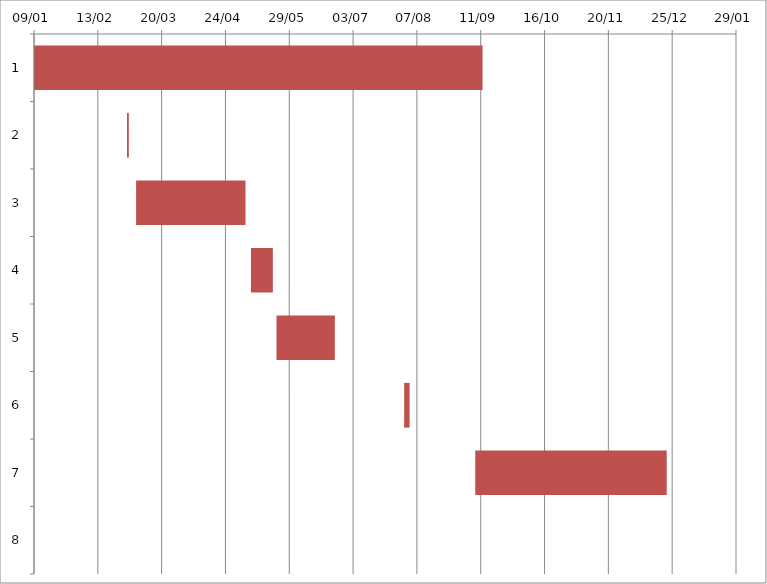
| Category | Fecha de inicio | DURACIÓN |
|---|---|---|
| 0 | 1/9/17 | 246 |
| 1 | 3/1/17 | 1 |
| 2 | 3/6/17 | 60 |
| 3 | 5/8/17 | 12 |
| 4 | 5/22/17 | 32 |
| 5 | 7/31/17 | 3 |
| 6 | 9/8/17 | 105 |
| 7 | 1/8/18 | 0 |